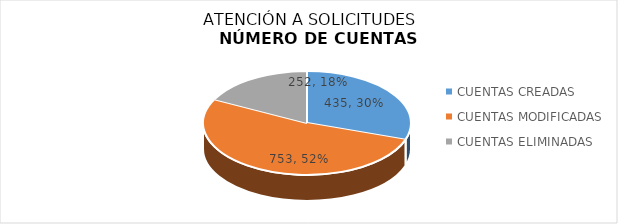
| Category | NÚMERO DE CUENTAS |
|---|---|
| CUENTAS CREADAS | 435 |
| CUENTAS MODIFICADAS | 753 |
| CUENTAS ELIMINADAS | 252 |